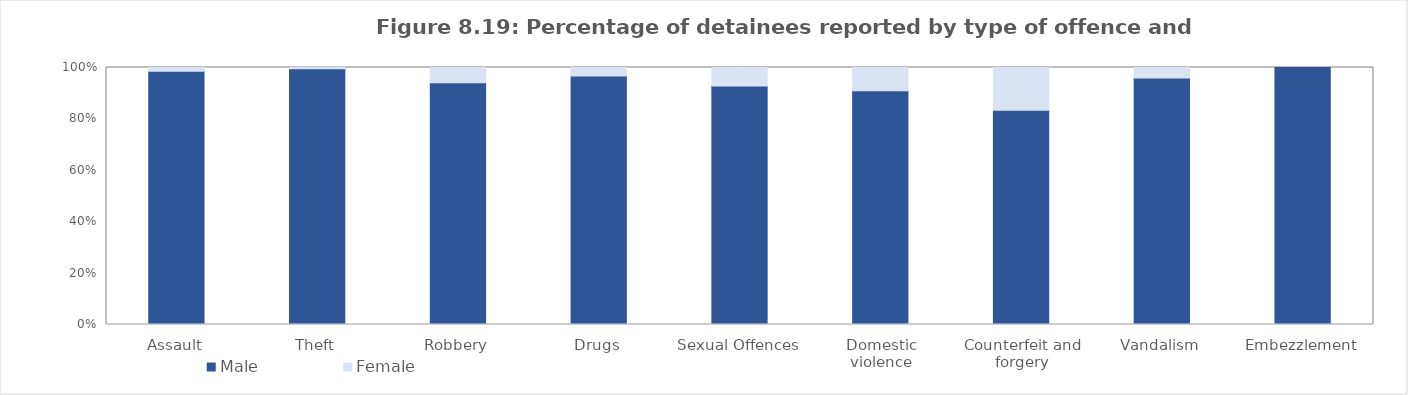
| Category | Male | Female |
|---|---|---|
| Assault | 98.492 | 1.508 |
| Theft | 99.517 | 0.483 |
| Robbery | 94.03 | 5.97 |
| Drugs | 96.698 | 3.302 |
| Sexual Offences | 92.8 | 7.2 |
| Domestic violence | 90.909 | 9.091 |
| Counterfeit and forgery | 83.333 | 16.667 |
| Vandalism | 95.918 | 4.082 |
| Embezzlement | 100 | 0 |